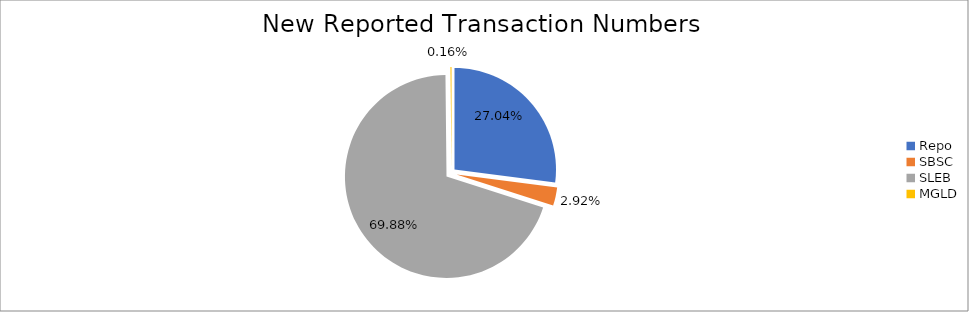
| Category | Series 0 |
|---|---|
| Repo | 386896 |
| SBSC | 41784 |
| SLEB | 1000009 |
| MGLD | 2341 |